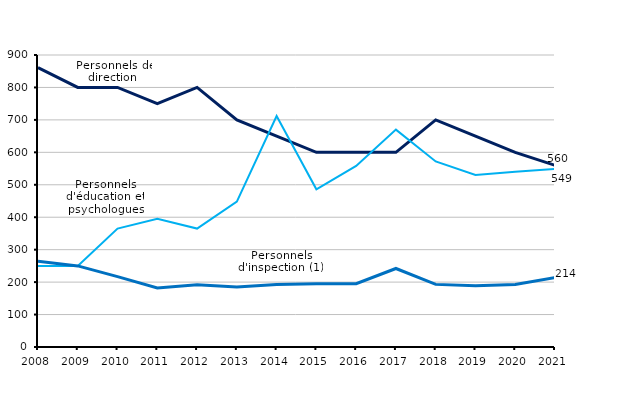
| Category | Personnels de direction  | Personnels d'éducation et psychologues | Personnels d'inspection (1) |
|---|---|---|---|
| 2008.0 | 861 | 250 | 264 |
| 2009.0 | 800 | 250 | 250 |
| 2010.0 | 800 | 365 | 217 |
| 2011.0 | 750 | 395 | 182 |
| 2012.0 | 800 | 365 | 192 |
| 2013.0 | 700 | 448 | 185 |
| 2014.0 | 650 | 712 | 193 |
| 2015.0 | 600 | 486 | 195 |
| 2016.0 | 600 | 558 | 195 |
| 2017.0 | 600 | 670 | 242 |
| 2018.0 | 700 | 572 | 193 |
| 2019.0 | 650 | 530 | 189 |
| 2020.0 | 600 | 540 | 193 |
| 2021.0 | 560 | 549 | 214 |